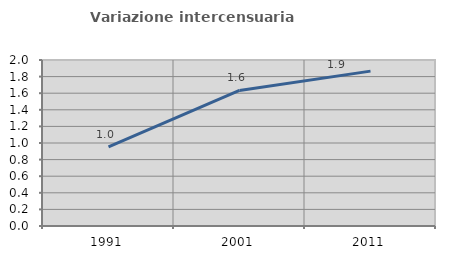
| Category | Variazione intercensuaria annua |
|---|---|
| 1991.0 | 0.953 |
| 2001.0 | 1.634 |
| 2011.0 | 1.866 |